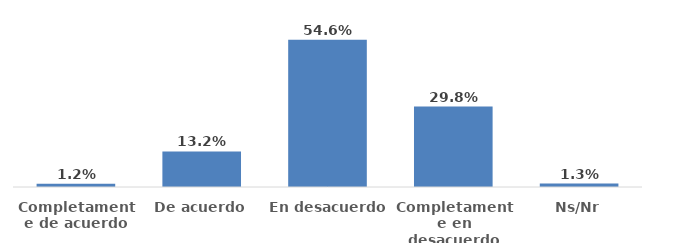
| Category | Series 0 |
|---|---|
| Completamente de acuerdo | 0.012 |
| De acuerdo | 0.132 |
| En desacuerdo | 0.546 |
| Completamente en desacuerdo | 0.298 |
| Ns/Nr | 0.013 |